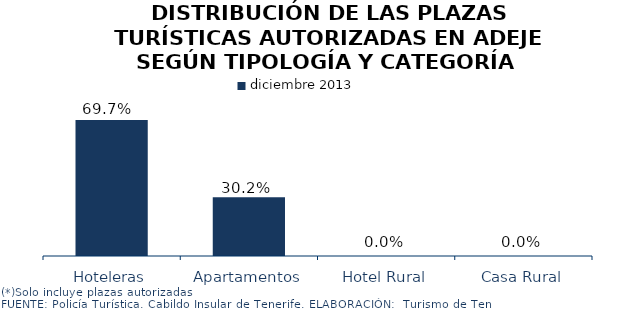
| Category | diciembre 2013 |
|---|---|
| Hoteleras | 0.697 |
| Apartamentos | 0.302 |
| Hotel Rural | 0 |
| Casa Rural | 0 |